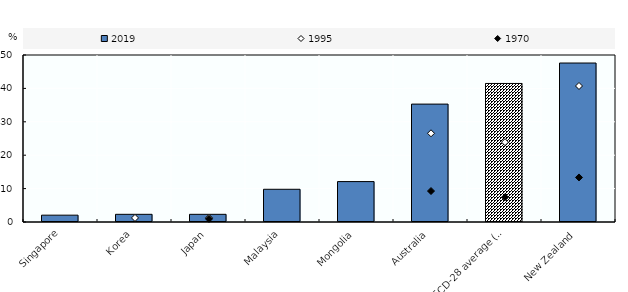
| Category | 2019 |
|---|---|
| Singapore | 2.046 |
| Korea | 2.3 |
| Japan | 2.3 |
| Malaysia | 9.8 |
| Mongolia | 12.1 |
| Australia | 35.3 |
| OECD-28 average (c) | 41.477 |
| New Zealand | 47.6 |